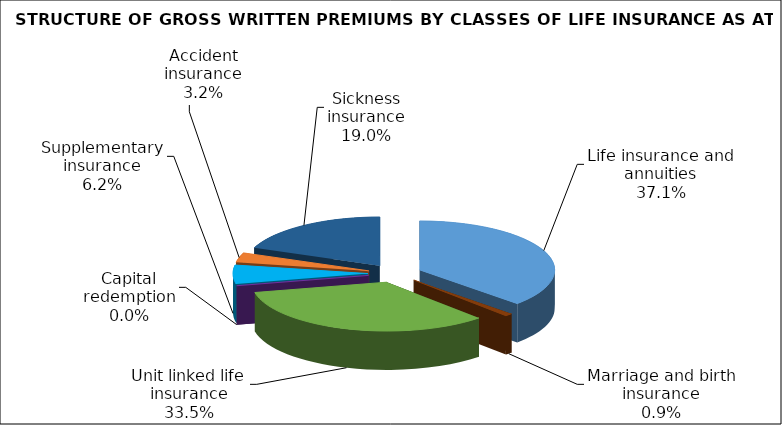
| Category | Series 0 |
|---|---|
| Life insurance and annuities | 83408397.261 |
| Marriage and birth insurance | 2057421.769 |
| Unit linked life insurance | 75342603.001 |
| Capital redemption | 0 |
| Supplementary insurance | 13909999.693 |
| Accident insurance | 7204244.374 |
| Sickness insurance | 42654394.264 |